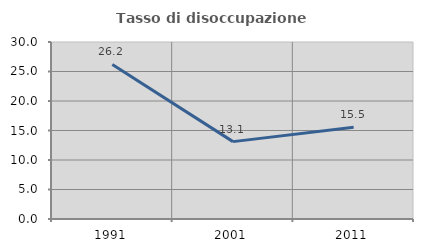
| Category | Tasso di disoccupazione giovanile  |
|---|---|
| 1991.0 | 26.19 |
| 2001.0 | 13.115 |
| 2011.0 | 15.534 |